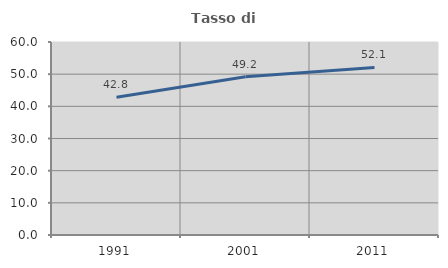
| Category | Tasso di occupazione   |
|---|---|
| 1991.0 | 42.83 |
| 2001.0 | 49.211 |
| 2011.0 | 52.097 |